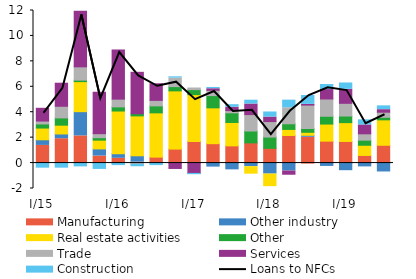
| Category | Manufacturing | Other industry | Real estate activities | Other | Trade | Services | Construction |
|---|---|---|---|---|---|---|---|
| I/15 | 1.388 | 0.445 | 0.922 | 0.321 | 0.229 | 1.003 | -0.4 |
| II | 1.916 | 0.374 | 0.691 | 0.572 | 0.915 | 1.814 | -0.4 |
| III | 2.137 | 1.906 | 2.363 | 0.117 | 1.046 | 4.372 | -0.3 |
| IV | 0.552 | 0.562 | 0.688 | 0.193 | 0.316 | 3.259 | -0.5 |
| I/16 | 0.372 | 0.362 | 3.359 | 0.325 | 0.608 | 3.869 | -0.2 |
| II | 0.072 | 0.502 | 3.138 | 0.17 | -0.089 | 3.256 | -0.2 |
| III | 0.454 | 0.013 | 3.483 | 0.549 | 0.432 | 1.308 | -0.2 |
| IV | 1.093 | 0.006 | 4.578 | 0.338 | 0.669 | -0.424 | 0.1 |
| I/17 | 1.697 | -0.007 | 3.685 | 0.393 | 0.129 | -0.807 | -0.1 |
| II | 1.525 | -0.317 | 2.819 | 0.964 | 0.413 | 0.125 | 0.1 |
| III | 1.353 | -0.534 | 1.841 | 0.758 | 0.173 | 0.267 | 0.2 |
| IV | 1.588 | -0.285 | -0.51 | 0.934 | 1.291 | 0.831 | 0.3 |
| I/18 | 1.158 | -0.865 | -0.911 | 0.888 | 1.216 | 0.357 | 0.4 |
| II | 2.167 | -0.624 | 0.481 | 0.442 | 1.258 | -0.254 | 0.6 |
| III | 2.025 | 0.159 | 0.235 | 0.299 | 1.841 | 0.054 | 0.7 |
| IV | 1.724 | -0.266 | 1.343 | 0.615 | 1.358 | 0.742 | 0.4 |
| I/19 | 1.7 | -0.6 | 1.481 | 0.519 | 1 | 1.1 | 0.5 |
| II | 0.6 | -0.3 | 0.8 | 0.4 | 0.5 | 0.7 | 0.4 |
| III | 1.4 | -0.7 | 2 | 0.2 | 0.4 | 0.2 | 0.3 |